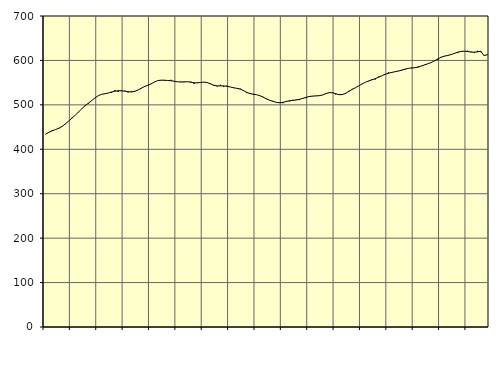
| Category | Piggar | Series 1 |
|---|---|---|
| nan | 433.7 | 434.3 |
| 87.0 | 438.2 | 438.15 |
| 87.0 | 443.5 | 441.67 |
| 87.0 | 444.2 | 444.37 |
| nan | 446.3 | 447.31 |
| 88.0 | 452.3 | 451.6 |
| 88.0 | 456.7 | 457.25 |
| 88.0 | 463.7 | 463.6 |
| nan | 470.9 | 470.22 |
| 89.0 | 476.8 | 476.99 |
| 89.0 | 483.4 | 484.13 |
| 89.0 | 491.3 | 491.46 |
| nan | 499.2 | 498.15 |
| 90.0 | 502.9 | 504.04 |
| 90.0 | 509.6 | 509.77 |
| 90.0 | 515.7 | 515.72 |
| nan | 521 | 520.71 |
| 91.0 | 523.7 | 523.68 |
| 91.0 | 524.7 | 525.03 |
| 91.0 | 526.6 | 526.55 |
| nan | 526.8 | 528.94 |
| 92.0 | 533.3 | 530.79 |
| 92.0 | 529 | 531.75 |
| 92.0 | 533.1 | 531.65 |
| nan | 532 | 530.78 |
| 93.0 | 527.9 | 529.59 |
| 93.0 | 530.5 | 528.97 |
| 93.0 | 528.9 | 530.32 |
| nan | 533.4 | 533.34 |
| 94.0 | 536.7 | 537.44 |
| 94.0 | 542.5 | 541.16 |
| 94.0 | 543.3 | 544.06 |
| nan | 546.7 | 547.3 |
| 95.0 | 551.9 | 551.33 |
| 95.0 | 554.7 | 554.63 |
| 95.0 | 556 | 555.57 |
| nan | 556.3 | 555.28 |
| 96.0 | 555.1 | 554.92 |
| 96.0 | 556.4 | 554.35 |
| 96.0 | 552.8 | 553.19 |
| nan | 552.2 | 551.93 |
| 97.0 | 552.3 | 551.4 |
| 97.0 | 551 | 551.82 |
| 97.0 | 552.3 | 551.99 |
| nan | 552.3 | 550.97 |
| 98.0 | 547.1 | 549.67 |
| 98.0 | 550.4 | 549.48 |
| 98.0 | 550.8 | 550.44 |
| nan | 551.1 | 551.21 |
| 99.0 | 550 | 550.21 |
| 99.0 | 548.1 | 547.26 |
| 99.0 | 542.4 | 544.12 |
| nan | 541.5 | 542.64 |
| 0.0 | 545.3 | 542.67 |
| 0.0 | 540.5 | 542.66 |
| 0.0 | 543.4 | 541.79 |
| nan | 540.3 | 540.28 |
| 1.0 | 537.8 | 538.54 |
| 1.0 | 537 | 537.19 |
| 1.0 | 536.8 | 535.54 |
| nan | 533.3 | 532.18 |
| 2.0 | 526.5 | 528.05 |
| 2.0 | 526 | 525.29 |
| 2.0 | 522.8 | 524.04 |
| nan | 522.7 | 522.81 |
| 3.0 | 520.3 | 520.58 |
| 3.0 | 518.1 | 517.17 |
| 3.0 | 512.9 | 513.46 |
| nan | 510.6 | 510.26 |
| 4.0 | 508.8 | 507.79 |
| 4.0 | 505.2 | 505.59 |
| 4.0 | 505.4 | 504.62 |
| nan | 503.6 | 505.7 |
| 5.0 | 508.8 | 507.6 |
| 5.0 | 507.6 | 509.21 |
| 5.0 | 511.4 | 510.09 |
| nan | 512 | 510.99 |
| 6.0 | 510.6 | 512.4 |
| 6.0 | 515.3 | 514.52 |
| 6.0 | 515 | 517 |
| nan | 519.7 | 518.78 |
| 7.0 | 519.2 | 519.73 |
| 7.0 | 520.5 | 520.15 |
| 7.0 | 520.2 | 520.65 |
| nan | 522 | 522.28 |
| 8.0 | 524.5 | 525.17 |
| 8.0 | 528.2 | 527.51 |
| 8.0 | 528.4 | 527.3 |
| nan | 523.1 | 525.06 |
| 9.0 | 522.1 | 522.89 |
| 9.0 | 524.4 | 523.07 |
| 9.0 | 524.6 | 525.99 |
| nan | 531.7 | 530.45 |
| 10.0 | 536 | 534.84 |
| 10.0 | 538.8 | 538.66 |
| 10.0 | 543 | 542.68 |
| nan | 547.4 | 547.03 |
| 11.0 | 550.9 | 550.87 |
| 11.0 | 553.1 | 553.84 |
| 11.0 | 557.9 | 556.3 |
| nan | 557 | 559.05 |
| 12.0 | 563.8 | 562.14 |
| 12.0 | 565.5 | 565.49 |
| 12.0 | 568 | 568.76 |
| nan | 573 | 571.23 |
| 13.0 | 571.6 | 573.11 |
| 13.0 | 574.4 | 574.57 |
| 13.0 | 575.7 | 576.21 |
| nan | 576.8 | 578.12 |
| 14.0 | 578.8 | 580.28 |
| 14.0 | 582.2 | 582.11 |
| 14.0 | 584 | 582.92 |
| nan | 582.9 | 583.5 |
| 15.0 | 586.4 | 584.9 |
| 15.0 | 587.8 | 587.48 |
| 15.0 | 590.7 | 590.02 |
| nan | 592.4 | 592.54 |
| 16.0 | 595.1 | 595.5 |
| 16.0 | 599.9 | 599.14 |
| 16.0 | 601.3 | 603.36 |
| nan | 608 | 607.23 |
| 17.0 | 610.2 | 609.66 |
| 17.0 | 610.4 | 611.13 |
| 17.0 | 612.2 | 613.1 |
| nan | 616.3 | 615.86 |
| 18.0 | 616.5 | 618.48 |
| 18.0 | 620.6 | 620.15 |
| 18.0 | 620.8 | 620.78 |
| nan | 621.9 | 620.08 |
| 19.0 | 619.8 | 618.83 |
| 19.0 | 616.8 | 618.54 |
| 19.0 | 621.8 | 619.29 |
| nan | 618.7 | 620.7 |
| 20.0 | 611.3 | 610.72 |
| 20.0 | 613.8 | 612.97 |